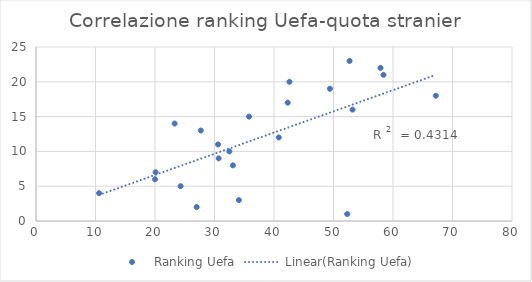
| Category | Ranking Uefa |
|---|---|
| 52.7 | 23 |
| 57.9 | 22 |
| 58.4 | 21 |
| 42.6 | 20 |
| 49.4 | 19 |
| 67.2 | 18 |
| 42.3 | 17 |
| 53.2 | 16 |
| 35.8 | 15 |
| 23.3 | 14 |
| 27.7 | 13 |
| 40.8 | 12 |
| 30.6 | 11 |
| 32.5 | 10 |
| 30.7 | 9 |
| 33.1 | 8 |
| 20.1 | 7 |
| 20.0 | 6 |
| 24.3 | 5 |
| 10.6 | 4 |
| 34.1 | 3 |
| 27.0 | 2 |
| 52.3 | 1 |